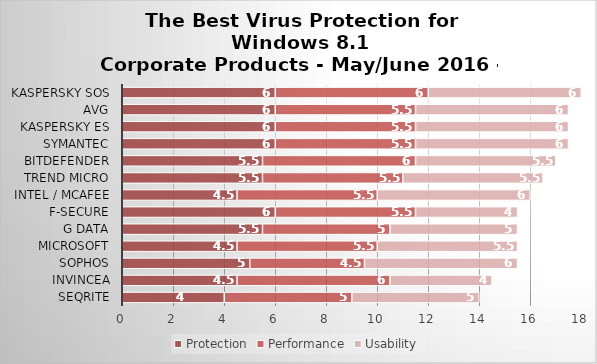
| Category | Protection | Performance | Usability |
|---|---|---|---|
| Seqrite | 4 | 5 | 5 |
| Invincea | 4.5 | 6 | 4 |
| Sophos | 5 | 4.5 | 6 |
| Microsoft | 4.5 | 5.5 | 5.5 |
| G Data | 5.5 | 5 | 5 |
| F-Secure | 6 | 5.5 | 4 |
| Intel / McAfee | 4.5 | 5.5 | 6 |
| Trend Micro | 5.5 | 5.5 | 5.5 |
| Bitdefender | 5.5 | 6 | 5.5 |
| Symantec | 6 | 5.5 | 6 |
| Kaspersky ES | 6 | 5.5 | 6 |
| AVG | 6 | 5.5 | 6 |
| Kaspersky SOS | 6 | 6 | 6 |